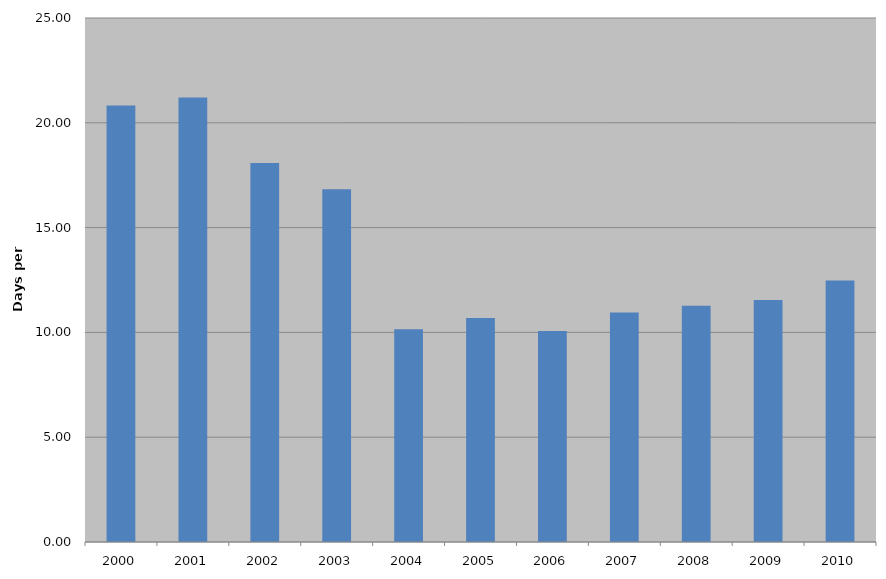
| Category | Total |
|---|---|
| 2000 | 20.828 |
| 2001 | 21.203 |
| 2002 | 18.077 |
| 2003 | 16.827 |
| 2004 | 10.145 |
| 2005 | 10.688 |
| 2006 | 10.071 |
| 2007 | 10.948 |
| 2008 | 11.274 |
| 2009 | 11.551 |
| 2010 | 12.471 |